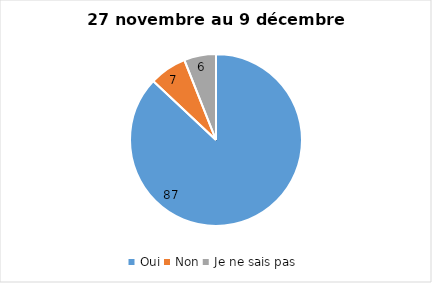
| Category | Series 0 |
|---|---|
| Oui | 87 |
| Non | 7 |
| Je ne sais pas | 6 |